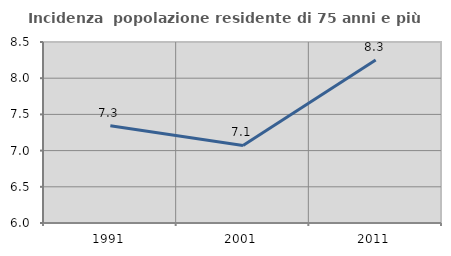
| Category | Incidenza  popolazione residente di 75 anni e più |
|---|---|
| 1991.0 | 7.345 |
| 2001.0 | 7.071 |
| 2011.0 | 8.25 |